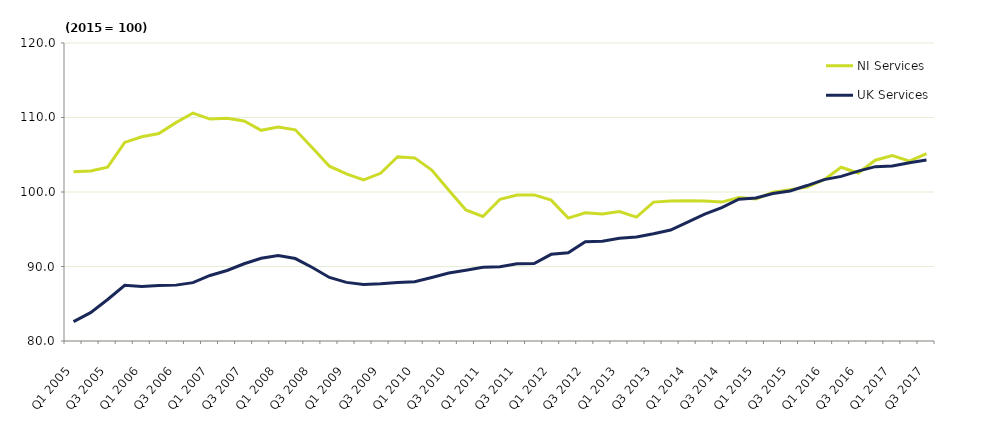
| Category | NI Services | UK Services |
|---|---|---|
| Q1 2005 | 102.708 | 82.6 |
| Q2 2005 | 102.824 | 83.8 |
| Q3 2005 | 103.336 | 85.567 |
| Q4 2005 | 106.653 | 87.467 |
| Q1 2006 | 107.407 | 87.3 |
| Q2 2006 | 107.856 | 87.433 |
| Q3 2006 | 109.313 | 87.5 |
| Q4 2006 | 110.6 | 87.833 |
| Q1 2007 | 109.787 | 88.8 |
| Q2 2007 | 109.889 | 89.467 |
| Q3 2007 | 109.532 | 90.367 |
| Q4 2007 | 108.278 | 91.1 |
| Q1 2008 | 108.733 | 91.467 |
| Q2 2008 | 108.347 | 91.067 |
| Q3 2008 | 105.947 | 89.867 |
| Q4 2008 | 103.466 | 88.533 |
| Q1 2009 | 102.421 | 87.867 |
| Q2 2009 | 101.635 | 87.6 |
| Q3 2009 | 102.511 | 87.7 |
| Q4 2009 | 104.736 | 87.867 |
| Q1 2010 | 104.578 | 87.967 |
| Q2 2010 | 102.953 | 88.533 |
| Q3 2010 | 100.235 | 89.133 |
| Q4 2010 | 97.589 | 89.5 |
| Q1 2011 | 96.71 | 89.9 |
| Q2 2011 | 99.019 | 89.967 |
| Q3 2011 | 99.598 | 90.367 |
| Q4 2011 | 99.606 | 90.4 |
| Q1 2012 | 98.91 | 91.633 |
| Q2 2012 | 96.498 | 91.833 |
| Q3 2012 | 97.2 | 93.333 |
| Q4 2012 | 97.055 | 93.4 |
| Q1 2013 | 97.385 | 93.8 |
| Q2 2013 | 96.634 | 93.967 |
| Q3 2013 | 98.645 | 94.4 |
| Q4 2013 | 98.791 | 94.9 |
| Q1 2014 | 98.834 | 95.967 |
| Q2 2014 | 98.779 | 97.033 |
| Q3 2014 | 98.648 | 97.9 |
| Q4 2014 | 99.271 | 99.033 |
| Q1 2015 | 99.055 | 99.2 |
| Q2 2015 | 99.959 | 99.8 |
| Q3 2015 | 100.32 | 100.133 |
| Q4 2015 | 100.666 | 100.867 |
| Q1 2016 | 101.64 | 101.667 |
| Q2 2016 | 103.317 | 102.1 |
| Q3 2016 | 102.545 | 102.8 |
| Q4 2016 | 104.268 | 103.4 |
| Q1 2017 | 104.885 | 103.5 |
| Q2 2017 | 104.142 | 103.933 |
| Q3 2017 | 105.155 | 104.3 |